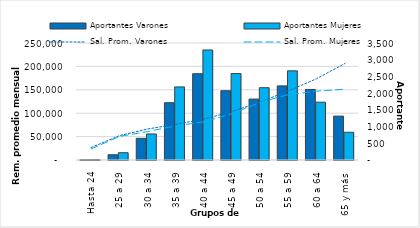
| Category | Aportantes Varones | Aportantes Mujeres |
|---|---|---|
| Hasta 24 | 8 | 12 |
| 25 a 29 | 157 | 218 |
| 30 a 34 | 648 | 779 |
| 35 a 39 | 1714 | 2186 |
| 40 a 44 | 2582 | 3292 |
| 45 a 49 | 2072 | 2585 |
| 50 a 54 | 1823 | 2163 |
| 55 a 59 | 2217 | 2667 |
| 60 a 64 | 2111 | 1729 |
| 65 y más | 1313 | 830 |